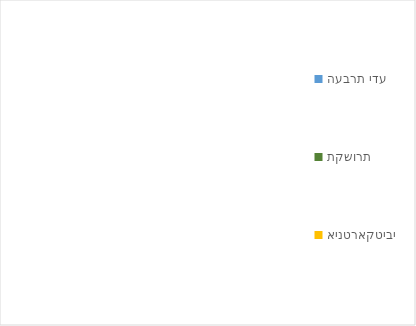
| Category | Series 0 |
|---|---|
| העברת ידע | 0 |
| תקשורת | 0 |
| אינטראקטיבי | 0 |